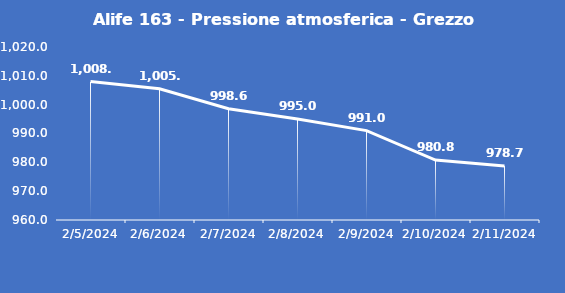
| Category | Alife 163 - Pressione atmosferica - Grezzo (hPa) |
|---|---|
| 2/5/24 | 1008 |
| 2/6/24 | 1005.5 |
| 2/7/24 | 998.6 |
| 2/8/24 | 995 |
| 2/9/24 | 991 |
| 2/10/24 | 980.8 |
| 2/11/24 | 978.7 |